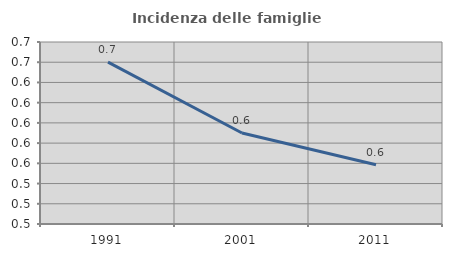
| Category | Incidenza delle famiglie numerose |
|---|---|
| 1991.0 | 0.66 |
| 2001.0 | 0.59 |
| 2011.0 | 0.559 |